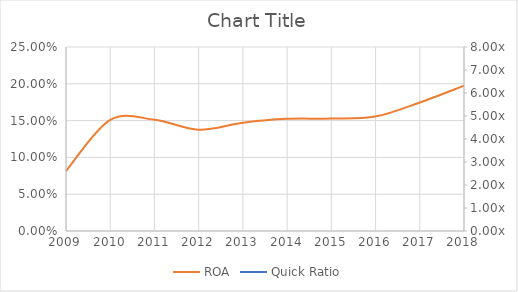
| Category | ROA |
|---|---|
| 2009.0 | 0.082 |
| 2010.0 | 0.151 |
| 2011.0 | 0.151 |
| 2012.0 | 0.138 |
| 2013.0 | 0.147 |
| 2014.0 | 0.152 |
| 2015.0 | 0.153 |
| 2016.0 | 0.156 |
| 2017.0 | 0.174 |
| 2018.0 | 0.197 |